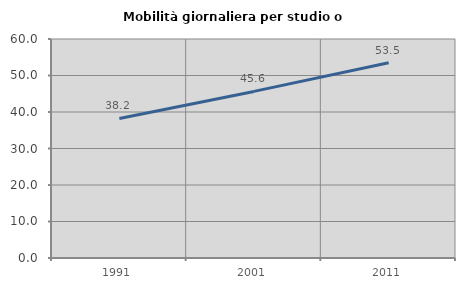
| Category | Mobilità giornaliera per studio o lavoro |
|---|---|
| 1991.0 | 38.223 |
| 2001.0 | 45.642 |
| 2011.0 | 53.501 |